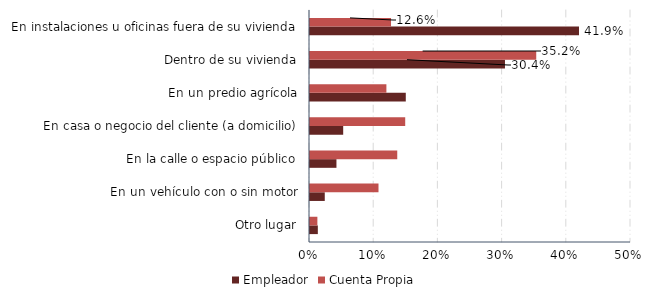
| Category | Empleador | Cuenta Propia |
|---|---|---|
| Otro lugar | 0.012 | 0.012 |
| En un vehículo con o sin motor | 0.023 | 0.107 |
| En la calle o espacio público | 0.041 | 0.136 |
| En casa o negocio del cliente (a domicilio) | 0.052 | 0.148 |
| En un predio agrícola | 0.149 | 0.119 |
| Dentro de su vivienda | 0.304 | 0.352 |
| En instalaciones u oficinas fuera de su vivienda | 0.419 | 0.126 |